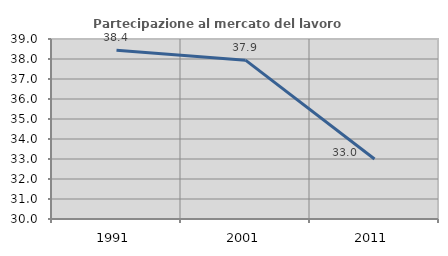
| Category | Partecipazione al mercato del lavoro  femminile |
|---|---|
| 1991.0 | 38.436 |
| 2001.0 | 37.943 |
| 2011.0 | 32.999 |